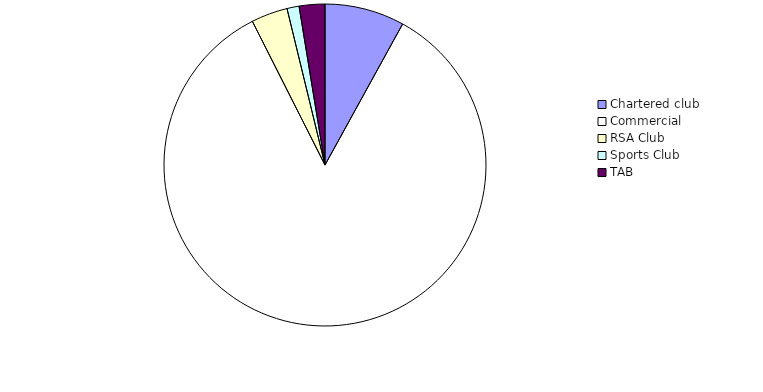
| Category | Series 0 |
|---|---|
| Chartered club | 16314979.49 |
| Commercial | 172170710.74 |
| RSA Club  | 7449117.02 |
| Sports Club | 2468200.27 |
| TAB | 5255474.29 |